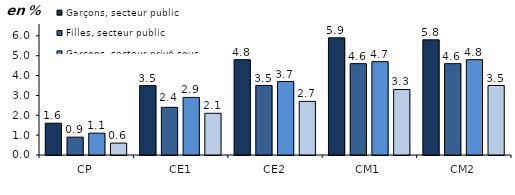
| Category | Garçons, secteur public | Filles, secteur public | Garçons, secteur privé sous contrat | Filles, secteur privé sous contrat |
|---|---|---|---|---|
| CP | 1.6 | 0.9 | 1.1 | 0.6 |
| CE1 | 3.5 | 2.4 | 2.9 | 2.1 |
| CE2 | 4.8 | 3.5 | 3.7 | 2.7 |
| CM1 | 5.9 | 4.6 | 4.7 | 3.3 |
| CM2 | 5.8 | 4.6 | 4.8 | 3.5 |